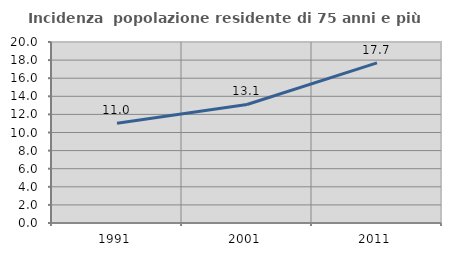
| Category | Incidenza  popolazione residente di 75 anni e più |
|---|---|
| 1991.0 | 11.012 |
| 2001.0 | 13.095 |
| 2011.0 | 17.696 |